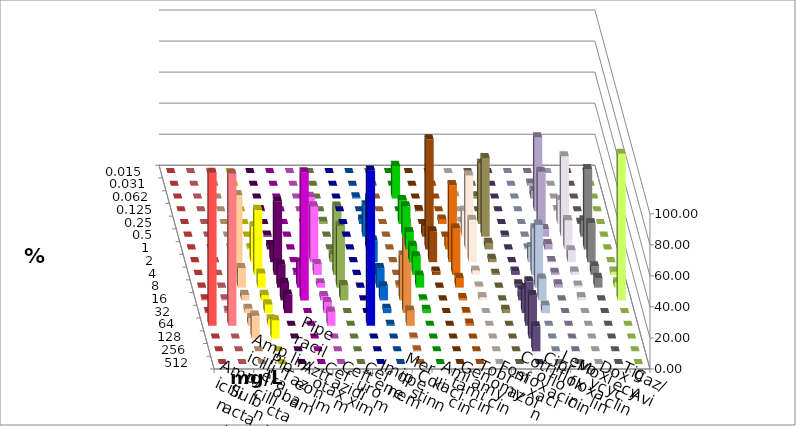
| Category | Ampicillin | Ampicillin/ Sulbactam | Piperacillin | Piperacillin/ Tazobactam | Aztreonam | Cefotaxim | Ceftazidim | Cefuroxim | Imipenem | Meropenem | Colistin | Amikacin | Gentamicin | Tobramycin | Fosfomycin | Cotrimoxazol | Ciprofloxacin | Levofloxacin | Moxifloxacin | Doxycyclin | Tigecyclin | Caz/Avi |
|---|---|---|---|---|---|---|---|---|---|---|---|---|---|---|---|---|---|---|---|---|---|---|
| 0.015 | 0 | 0 | 0 | 0 | 0 | 0 | 0 | 0 | 0 | 0 | 0 | 0 | 0 | 0 | 0 | 0 | 0 | 0 | 0 | 0 | 0 | 0 |
| 0.031 | 0 | 0 | 0 | 0 | 0 | 0 | 0 | 0 | 0 | 0 | 0 | 0 | 0 | 0 | 0 | 0 | 1.399 | 0 | 0 | 0 | 0 | 0 |
| 0.062 | 0 | 0 | 0 | 0 | 0 | 0 | 0 | 0 | 0.699 | 20.979 | 0 | 0 | 1.399 | 1.408 | 0 | 0 | 4.895 | 0 | 0 | 0 | 0 | 0 |
| 0.125 | 0 | 0 | 0 | 0 | 0.704 | 0 | 0 | 0 | 0 | 0 | 0.709 | 0 | 0 | 0 | 0 | 0 | 47.552 | 0.699 | 0 | 0 | 0 | 0 |
| 0.25 | 0 | 0 | 0 | 0 | 0 | 0 | 0 | 0 | 2.797 | 15.385 | 0 | 2.797 | 1.399 | 38.732 | 0 | 0 | 33.566 | 15.385 | 0.699 | 0 | 1.399 | 0 |
| 0.5 | 0 | 0 | 0 | 0 | 0.704 | 0 | 1.408 | 0 | 20.28 | 19.58 | 6.383 | 0 | 16.783 | 50.704 | 0.699 | 0 | 4.895 | 51.748 | 10.49 | 0 | 0 | 0 |
| 1.0 | 0 | 0 | 0.704 | 0.699 | 2.817 | 0 | 33.803 | 0 | 32.867 | 11.189 | 70.922 | 7.692 | 47.552 | 4.225 | 0 | 0.699 | 3.497 | 18.881 | 51.748 | 0 | 0 | 0 |
| 2.0 | 0 | 0 | 9.155 | 23.077 | 10.563 | 0 | 35.915 | 0 | 13.986 | 10.49 | 19.858 | 49.65 | 27.273 | 2.113 | 0 | 9.79 | 0.699 | 7.692 | 25.175 | 0 | 4.895 | 0 |
| 4.0 | 0 | 0 | 51.408 | 41.958 | 47.183 | 1.399 | 7.042 | 0 | 4.196 | 11.888 | 2.128 | 30.07 | 2.797 | 0.704 | 2.098 | 30.07 | 1.399 | 2.098 | 5.594 | 2.098 | 44.056 | 0 |
| 8.0 | 0 | 0 | 12.676 | 9.091 | 14.789 | 16.084 | 2.817 | 0 | 12.587 | 7.692 | 0 | 6.294 | 0.699 | 0 | 2.098 | 40.559 | 2.098 | 1.399 | 6.294 | 3.497 | 39.86 | 1.408 |
| 16.0 | 0.704 | 0.699 | 3.521 | 3.497 | 11.268 | 82.517 | 2.817 | 0 | 9.091 | 0.699 | 0 | 1.399 | 2.098 | 0 | 6.294 | 13.986 | 0 | 2.098 | 0 | 94.406 | 9.79 | 28.873 |
| 32.0 | 0.704 | 1.399 | 2.817 | 5.594 | 11.972 | 0 | 7.042 | 0 | 2.797 | 2.098 | 0 | 0.699 | 0 | 2.113 | 16.084 | 4.895 | 0 | 0 | 0 | 0 | 0 | 58.451 |
| 64.0 | 98.592 | 97.902 | 4.93 | 4.196 | 0 | 0 | 9.155 | 100 | 0.699 | 0 | 0 | 1.399 | 0 | 0 | 28.671 | 0 | 0 | 0 | 0 | 0 | 0 | 9.859 |
| 128.0 | 0 | 0 | 14.789 | 11.888 | 0 | 0 | 0 | 0 | 0 | 0 | 0 | 0 | 0 | 0 | 27.972 | 0 | 0 | 0 | 0 | 0 | 0 | 0.704 |
| 256.0 | 0 | 0 | 0 | 0 | 0 | 0 | 0 | 0 | 0 | 0 | 0 | 0 | 0 | 0 | 16.084 | 0 | 0 | 0 | 0 | 0 | 0 | 0.704 |
| 512.0 | 0 | 0 | 0 | 0 | 0 | 0 | 0 | 0 | 0 | 0 | 0 | 0 | 0 | 0 | 0 | 0 | 0 | 0 | 0 | 0 | 0 | 0 |